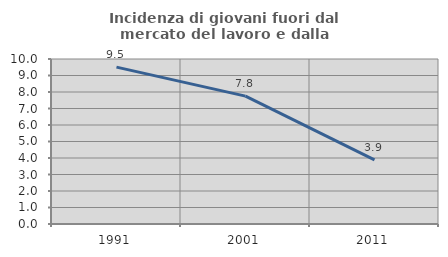
| Category | Incidenza di giovani fuori dal mercato del lavoro e dalla formazione  |
|---|---|
| 1991.0 | 9.509 |
| 2001.0 | 7.752 |
| 2011.0 | 3.883 |